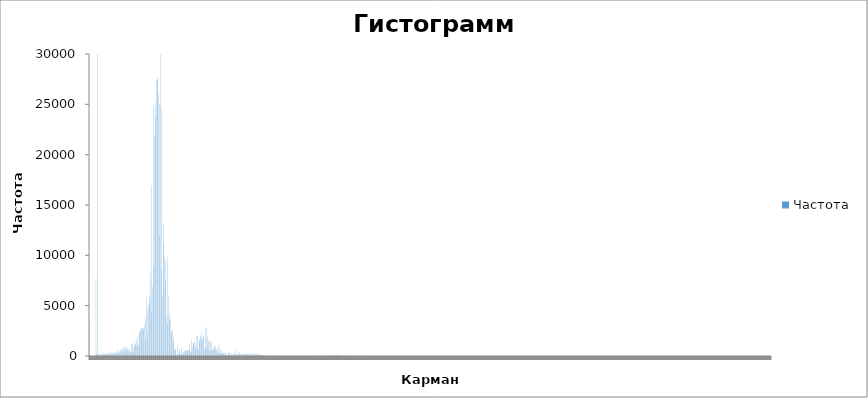
| Category | Частота |
|---|---|
| -1 | 3320 |
| -0,896408203 | 0 |
| -0,792816406 | 0 |
| -0,689224609 | 0 |
| -0,585632813 | 0 |
| -0,482041016 | 0 |
| -0,378449219 | 0 |
| -0,274857422 | 0 |
| -0,171265625 | 0 |
| -0,067673828 | 0 |
| 0,035917969 | 7700 |
| 0,139509766 | 240 |
| 0,243101563 | 80634 |
| 0,346693359 | 180 |
| 0,450285156 | 180 |
| 0,553876953 | 120 |
| 0,65746875 | 160 |
| 0,761060547 | 180 |
| 0,864652344 | 100 |
| 0,968244141 | 460 |
| 1,071835938 | 60 |
| 1,175427734 | 280 |
| 1,279019531 | 220 |
| 1,382611328 | 200 |
| 1,486203125 | 180 |
| 1,589794922 | 260 |
| 1,693386719 | 200 |
| 1,796978516 | 240 |
| 1,900570313 | 220 |
| 2,004162109 | 300 |
| 2,107753906 | 120 |
| 2,211345703 | 420 |
| 2,3149375 | 360 |
| 2,418529297 | 160 |
| 2,522121094 | 360 |
| 2,625712891 | 200 |
| 2,729304688 | 320 |
| 2,832896484 | 320 |
| 2,936488281 | 260 |
| 3,040080078 | 320 |
| 3,143671875 | 400 |
| 3,247263672 | 180 |
| 3,350855469 | 680 |
| 3,454447266 | 320 |
| 3,558039063 | 440 |
| 3,661630859 | 500 |
| 3,765222656 | 300 |
| 3,868814453 | 700 |
| 3,97240625 | 560 |
| 4,075998047 | 320 |
| 4,179589844 | 800 |
| 4,283181641 | 540 |
| 4,386773438 | 980 |
| 4,490365234 | 440 |
| 4,593957031 | 820 |
| 4,697548828 | 900 |
| 4,801140625 | 660 |
| 4,904732422 | 560 |
| 5,008324219 | 880 |
| 5,111916016 | 520 |
| 5,215507813 | 620 |
| 5,319099609 | 700 |
| 5,422691406 | 380 |
| 5,526283203 | 1160 |
| 5,629875 | 380 |
| 5,733466797 | 1280 |
| 5,837058594 | 420 |
| 5,940650391 | 940 |
| 6,044242188 | 1540 |
| 6,147833984 | 1160 |
| 6,251425781 | 1140 |
| 6,355017578 | 1600 |
| 6,458609375 | 980 |
| 6,562201172 | 2020 |
| 6,665792969 | 1120 |
| 6,769384766 | 2420 |
| 6,872976563 | 2200 |
| 6,976568359 | 2720 |
| 7,080160156 | 2620 |
| 7,183751953 | 2780 |
| 7,28734375 | 2760 |
| 7,390935547 | 2600 |
| 7,494527344 | 2800 |
| 7,598119141 | 3140 |
| 7,701710938 | 3800 |
| 7,805302734 | 1540 |
| 7,908894531 | 5860 |
| 8,012486328 | 2180 |
| 8,116078125 | 4580 |
| 8,219669922 | 5080 |
| 8,323261719 | 5380 |
| 8,426853516 | 6000 |
| 8,530445313 | 8240 |
| 8,634037109 | 4400 |
| 8,737628906 | 16940 |
| 8,841220703 | 6880 |
| 8,9448125 | 24860 |
| 9,048404297 | 8800 |
| 9,151996094 | 21700 |
| 9,255587891 | 23720 |
| 9,359179688 | 25180 |
| 9,462771484 | 27400 |
| 9,566363281 | 27620 |
| 9,669955078 | 27480 |
| 9,773546875 | 26160 |
| 9,877138672 | 25000 |
| 9,980730469 | 11960 |
| 10,08432227 | 30760 |
| 10,18791406 | 8580 |
| 10,29150586 | 24640 |
| 10,39509766 | 6100 |
| 10,49868945 | 13160 |
| 10,60228125 | 11260 |
| 10,70587305 | 9920 |
| 10,80946484 | 9520 |
| 10,91305664 | 7380 |
| 11,01664844 | 3920 |
| 11,12024023 | 9880 |
| 11,22383203 | 3120 |
| 11,32742383 | 5881 |
| 11,43101563 | 4260 |
| 11,53460742 | 3500 |
| 11,63819922 | 3620 |
| 11,74179102 | 2420 |
| 11,84538281 | 2420 |
| 11,94897461 | 2640 |
| 12,05256641 | 1860 |
| 12,1561582 | 1420 |
| 12,25975 | 720 |
| 12,3633418 | 500 |
| 12,46693359 | 740 |
| 12,57052539 | 120 |
| 12,67411719 | 1100 |
| 12,77770898 | 180 |
| 12,88130078 | 220 |
| 12,98489258 | 500 |
| 13,08848438 | 580 |
| 13,19207617 | 200 |
| 13,29566797 | 840 |
| 13,39925977 | 160 |
| 13,50285156 | 400 |
| 13,60644336 | 240 |
| 13,71003516 | 360 |
| 13,81362695 | 460 |
| 13,91721875 | 560 |
| 14,02081055 | 540 |
| 14,12440234 | 580 |
| 14,22799414 | 560 |
| 14,33158594 | 600 |
| 14,43517773 | 560 |
| 14,53876953 | 620 |
| 14,64236133 | 1180 |
| 14,74595313 | 320 |
| 14,84954492 | 1680 |
| 14,95313672 | 480 |
| 15,05672852 | 980 |
| 15,16032031 | 1320 |
| 15,26391211 | 1280 |
| 15,36750391 | 1340 |
| 15,4710957 | 1000 |
| 15,5746875 | 680 |
| 15,6782793 | 1960 |
| 15,78187109 | 720 |
| 15,88546289 | 2020 |
| 15,98905469 | 660 |
| 16,09264648 | 1700 |
| 16,19623828 | 1500 |
| 16,29983008 | 2040 |
| 16,40342188 | 2380 |
| 16,50701367 | 1660 |
| 16,61060547 | 1720 |
| 16,71419727 | 1940 |
| 16,81778906 | 2000 |
| 16,92138086 | 680 |
| 17,02497266 | 2720 |
| 17,12856445 | 860 |
| 17,23215625 | 2840 |
| 17,33574805 | 860 |
| 17,43933984 | 1900 |
| 17,54293164 | 1560 |
| 17,64652344 | 1520 |
| 17,75011523 | 520 |
| 17,85370703 | 1400 |
| 17,95729883 | 600 |
| 18,06089063 | 1500 |
| 18,16448242 | 560 |
| 18,26807422 | 700 |
| 18,37166602 | 840 |
| 18,47525781 | 1040 |
| 18,57884961 | 940 |
| 18,68244141 | 600 |
| 18,7860332 | 580 |
| 18,889625 | 860 |
| 18,9932168 | 640 |
| 19,09680859 | 360 |
| 19,20040039 | 1180 |
| 19,30399219 | 300 |
| 19,40758398 | 660 |
| 19,51117578 | 200 |
| 19,61476758 | 460 |
| 19,71835938 | 280 |
| 19,82195117 | 300 |
| 19,92554297 | 300 |
| 20,02913477 | 280 |
| 20,13272656 | 160 |
| 20,23631836 | 380 |
| 20,33991016 | 60 |
| 20,44350195 | 140 |
| 20,54709375 | 120 |
| 20,65068555 | 300 |
| 20,75427734 | 380 |
| 20,85786914 | 280 |
| 20,96146094 | 80 |
| 21,06505273 | 100 |
| 21,16864453 | 280 |
| 21,27223633 | 200 |
| 21,37582813 | 160 |
| 21,47941992 | 40 |
| 21,58301172 | 300 |
| 21,68660352 | 120 |
| 21,79019531 | 560 |
| 21,89378711 | 40 |
| 21,99737891 | 180 |
| 22,1009707 | 320 |
| 22,2045625 | 180 |
| 22,3081543 | 100 |
| 22,41174609 | 380 |
| 22,51533789 | 80 |
| 22,61892969 | 260 |
| 22,72252148 | 120 |
| 22,82611328 | 120 |
| 22,92970508 | 220 |
| 23,03329688 | 200 |
| 23,13688867 | 140 |
| 23,24048047 | 160 |
| 23,34407227 | 280 |
| 23,44766406 | 100 |
| 23,55125586 | 240 |
| 23,65484766 | 200 |
| 23,75843945 | 300 |
| 23,86203125 | 160 |
| 23,96562305 | 200 |
| 24,06921484 | 60 |
| 24,17280664 | 300 |
| 24,27639844 | 140 |
| 24,37999023 | 200 |
| 24,48358203 | 140 |
| 24,58717383 | 100 |
| 24,69076563 | 120 |
| 24,79435742 | 300 |
| 24,89794922 | 120 |
| 25,00154102 | 280 |
| 25,10513281 | 120 |
| 25,20872461 | 160 |
| 25,31231641 | 180 |
| 25,4159082 | 140 |
| 25,5195 | 100 |
| 25,6230918 | 120 |
| 25,72668359 | 40 |
| 25,83027539 | 100 |
| 25,93386719 | 40 |
| 26,03745898 | 60 |
| 26,14105078 | 80 |
| 26,24464258 | 0 |
| 26,34823438 | 80 |
| 26,45182617 | 80 |
| 26,55541797 | 20 |
| 26,65900977 | 60 |
| 26,76260156 | 40 |
| 26,86619336 | 0 |
| 26,96978516 | 0 |
| 27,07337695 | 60 |
| 27,17696875 | 0 |
| 27,28056055 | 0 |
| 27,38415234 | 20 |
| 27,48774414 | 40 |
| 27,59133594 | 0 |
| 27,69492773 | 0 |
| 27,79851953 | 60 |
| 27,90211133 | 60 |
| 28,00570313 | 60 |
| 28,10929492 | 40 |
| 28,21288672 | 20 |
| 28,31647852 | 20 |
| 28,42007031 | 0 |
| 28,52366211 | 20 |
| 28,62725391 | 0 |
| 28,7308457 | 20 |
| 28,8344375 | 0 |
| 28,9380293 | 0 |
| 29,04162109 | 0 |
| 29,14521289 | 0 |
| 29,24880469 | 20 |
| 29,35239648 | 40 |
| 29,45598828 | 0 |
| 29,55958008 | 40 |
| 29,66317188 | 0 |
| 29,76676367 | 0 |
| 29,87035547 | 20 |
| 29,97394727 | 60 |
| 30,07753906 | 40 |
| 30,18113086 | 20 |
| 30,28472266 | 40 |
| 30,38831445 | 60 |
| 30,49190625 | 0 |
| 30,59549805 | 0 |
| 30,69908984 | 0 |
| 30,80268164 | 0 |
| 30,90627344 | 20 |
| 31,00986523 | 0 |
| 31,11345703 | 0 |
| 31,21704883 | 20 |
| 31,32064063 | 60 |
| 31,42423242 | 0 |
| 31,52782422 | 20 |
| 31,63141602 | 0 |
| 31,73500781 | 0 |
| 31,83859961 | 0 |
| 31,94219141 | 40 |
| 32,0457832 | 0 |
| 32,149375 | 0 |
| 32,2529668 | 40 |
| 32,35655859 | 0 |
| 32,46015039 | 20 |
| 32,56374219 | 20 |
| 32,66733398 | 0 |
| 32,77092578 | 40 |
| 32,87451758 | 60 |
| 32,97810938 | 0 |
| 33,08170117 | 0 |
| 33,18529297 | 0 |
| 33,28888477 | 20 |
| 33,39247656 | 0 |
| 33,49606836 | 0 |
| 33,59966016 | 0 |
| 33,70325195 | 0 |
| 33,80684375 | 0 |
| 33,91043555 | 120 |
| 34,01402734 | 0 |
| 34,11761914 | 40 |
| 34,22121094 | 80 |
| 34,32480273 | 0 |
| 34,42839453 | 40 |
| 34,53198633 | 20 |
| 34,63557813 | 20 |
| 34,73916992 | 0 |
| 34,84276172 | 0 |
| 34,94635352 | 80 |
| 35,04994531 | 60 |
| 35,15353711 | 0 |
| 35,25712891 | 20 |
| 35,3607207 | 40 |
| 35,4643125 | 20 |
| 35,5679043 | 0 |
| 35,67149609 | 60 |
| 35,77508789 | 40 |
| 35,87867969 | 40 |
| 35,98227148 | 0 |
| 36,08586328 | 20 |
| 36,18945508 | 20 |
| 36,29304688 | 40 |
| 36,39663867 | 0 |
| 36,50023047 | 20 |
| 36,60382227 | 0 |
| 36,70741406 | 60 |
| 36,81100586 | 80 |
| 36,91459766 | 60 |
| 37,01818945 | 60 |
| 37,12178125 | 100 |
| 37,22537305 | 40 |
| 37,32896484 | 80 |
| 37,43255664 | 120 |
| 37,53614844 | 20 |
| 37,63974023 | 100 |
| 37,74333203 | 0 |
| 37,84692383 | 40 |
| 37,95051563 | 40 |
| 38,05410742 | 20 |
| 38,15769922 | 40 |
| 38,26129102 | 40 |
| 38,36488281 | 0 |
| 38,46847461 | 40 |
| 38,57206641 | 40 |
| 38,6756582 | 60 |
| 38,77925 | 0 |
| 38,8828418 | 40 |
| 38,98643359 | 20 |
| 39,09002539 | 0 |
| 39,19361719 | 40 |
| 39,29720898 | 0 |
| 39,40080078 | 20 |
| 39,50439258 | 40 |
| 39,60798438 | 40 |
| 39,71157617 | 20 |
| 39,81516797 | 20 |
| 39,91875977 | 20 |
| 40,02235156 | 0 |
| 40,12594336 | 0 |
| 40,22953516 | 20 |
| 40,33312695 | 40 |
| 40,43671875 | 60 |
| 40,54031055 | 40 |
| 40,64390234 | 20 |
| 40,74749414 | 20 |
| 40,85108594 | 20 |
| 40,95467773 | 40 |
| 41,05826953 | 0 |
| 41,16186133 | 80 |
| 41,26545313 | 80 |
| 41,36904492 | 0 |
| 41,47263672 | 20 |
| 41,57622852 | 0 |
| 41,67982031 | 0 |
| 41,78341211 | 0 |
| 41,88700391 | 20 |
| 41,9905957 | 20 |
| 42,0941875 | 20 |
| 42,1977793 | 40 |
| 42,30137109 | 0 |
| 42,40496289 | 40 |
| 42,50855469 | 0 |
| 42,61214648 | 0 |
| 42,71573828 | 0 |
| 42,81933008 | 20 |
| 42,92292188 | 0 |
| 43,02651367 | 0 |
| 43,13010547 | 40 |
| 43,23369727 | 0 |
| 43,33728906 | 0 |
| 43,44088086 | 0 |
| 43,54447266 | 0 |
| 43,64806445 | 20 |
| 43,75165625 | 40 |
| 43,85524805 | 40 |
| 43,95883984 | 0 |
| 44,06243164 | 0 |
| 44,16602344 | 0 |
| 44,26961523 | 0 |
| 44,37320703 | 20 |
| 44,47679883 | 0 |
| 44,58039063 | 0 |
| 44,68398242 | 0 |
| 44,78757422 | 20 |
| 44,89116602 | 0 |
| 44,99475781 | 0 |
| 45,09834961 | 20 |
| 45,20194141 | 0 |
| 45,3055332 | 20 |
| 45,409125 | 20 |
| 45,5127168 | 0 |
| 45,61630859 | 0 |
| 45,71990039 | 0 |
| 45,82349219 | 0 |
| 45,92708398 | 0 |
| 46,03067578 | 0 |
| 46,13426758 | 0 |
| 46,23785938 | 0 |
| 46,34145117 | 0 |
| 46,44504297 | 0 |
| 46,54863477 | 0 |
| 46,65222656 | 0 |
| 46,75581836 | 0 |
| 46,85941016 | 0 |
| 46,96300195 | 0 |
| 47,06659375 | 0 |
| 47,17018555 | 0 |
| 47,27377734 | 0 |
| 47,37736914 | 40 |
| 47,48096094 | 0 |
| 47,58455273 | 0 |
| 47,68814453 | 0 |
| 47,79173633 | 0 |
| 47,89532813 | 0 |
| 47,99891992 | 0 |
| 48,10251172 | 0 |
| 48,20610352 | 0 |
| 48,30969531 | 0 |
| 48,41328711 | 20 |
| 48,51687891 | 0 |
| 48,6204707 | 0 |
| 48,7240625 | 20 |
| 48,8276543 | 0 |
| 48,93124609 | 40 |
| 49,03483789 | 40 |
| 49,13842969 | 0 |
| 49,24202148 | 0 |
| 49,34561328 | 0 |
| 49,44920508 | 20 |
| 49,55279688 | 0 |
| 49,65638867 | 0 |
| 49,75998047 | 0 |
| 49,86357227 | 0 |
| 49,96716406 | 0 |
| 50,07075586 | 0 |
| 50,17434766 | 0 |
| 50,27793945 | 20 |
| 50,38153125 | 0 |
| 50,48512305 | 0 |
| 50,58871484 | 0 |
| 50,69230664 | 0 |
| 50,79589844 | 0 |
| 50,89949023 | 0 |
| 51,00308203 | 0 |
| 51,10667383 | 0 |
| 51,21026563 | 0 |
| 51,31385742 | 0 |
| 51,41744922 | 0 |
| 51,52104102 | 0 |
| 51,62463281 | 0 |
| 51,72822461 | 0 |
| 51,83181641 | 0 |
| 51,9354082 | 0 |
| 52,039 | 0 |
| 52,1425918 | 20 |
| 52,24618359 | 0 |
| 52,34977539 | 0 |
| 52,45336719 | 0 |
| 52,55695898 | 0 |
| 52,66055078 | 20 |
| 52,76414258 | 0 |
| 52,86773438 | 0 |
| 52,97132617 | 0 |
| 53,07491797 | 0 |
| 53,17850977 | 0 |
| 53,28210156 | 0 |
| 53,38569336 | 0 |
| 53,48928516 | 0 |
| 53,59287695 | 0 |
| 53,69646875 | 0 |
| 53,80006055 | 0 |
| 53,90365234 | 40 |
| 54,00724414 | 0 |
| 54,11083594 | 0 |
| 54,21442773 | 0 |
| 54,31801953 | 0 |
| 54,42161133 | 0 |
| 54,52520313 | 0 |
| 54,62879492 | 0 |
| 54,73238672 | 0 |
| 54,83597852 | 0 |
| 54,93957031 | 0 |
| 55,04316211 | 0 |
| 55,14675391 | 0 |
| 55,2503457 | 0 |
| 55,3539375 | 0 |
| 55,4575293 | 0 |
| 55,56112109 | 0 |
| 55,66471289 | 0 |
| 55,76830469 | 0 |
| 55,87189648 | 0 |
| 55,97548828 | 0 |
| 56,07908008 | 0 |
| 56,18267188 | 0 |
| 56,28626367 | 0 |
| 56,38985547 | 0 |
| 56,49344727 | 0 |
| 56,59703906 | 0 |
| 56,70063086 | 0 |
| 56,80422266 | 0 |
| 56,90781445 | 0 |
| 57,01140625 | 0 |
| 57,11499805 | 0 |
| 57,21858984 | 0 |
| 57,32218164 | 0 |
| 57,42577344 | 20 |
| 57,52936523 | 20 |
| 57,63295703 | 0 |
| 57,73654883 | 0 |
| 57,84014063 | 0 |
| 57,94373242 | 0 |
| 58,04732422 | 0 |
| 58,15091602 | 0 |
| 58,25450781 | 0 |
| 58,35809961 | 0 |
| 58,46169141 | 0 |
| 58,5652832 | 0 |
| 58,668875 | 0 |
| 58,7724668 | 0 |
| 58,87605859 | 0 |
| 58,97965039 | 0 |
| 59,08324219 | 0 |
| 59,18683398 | 0 |
| 59,29042578 | 0 |
| 59,39401758 | 0 |
| 59,49760938 | 0 |
| 59,60120117 | 0 |
| 59,70479297 | 0 |
| 59,80838477 | 0 |
| 59,91197656 | 0 |
| 60,01556836 | 0 |
| 60,11916016 | 0 |
| 60,22275195 | 0 |
| 60,32634375 | 0 |
| 60,42993555 | 0 |
| 60,53352734 | 0 |
| 60,63711914 | 0 |
| 60,74071094 | 0 |
| 60,84430273 | 0 |
| 60,94789453 | 0 |
| 61,05148633 | 0 |
| 61,15507813 | 0 |
| 61,25866992 | 0 |
| 61,36226172 | 0 |
| 61,46585352 | 0 |
| 61,56944531 | 0 |
| 61,67303711 | 0 |
| 61,77662891 | 0 |
| 61,8802207 | 0 |
| 61,9838125 | 0 |
| 62,0874043 | 0 |
| 62,19099609 | 0 |
| 62,29458789 | 20 |
| 62,39817969 | 0 |
| 62,50177148 | 0 |
| 62,60536328 | 0 |
| 62,70895508 | 0 |
| 62,81254688 | 0 |
| 62,91613867 | 0 |
| 63,01973047 | 0 |
| 63,12332227 | 0 |
| 63,22691406 | 0 |
| 63,33050586 | 0 |
| 63,43409766 | 0 |
| 63,53768945 | 0 |
| 63,64128125 | 0 |
| 63,74487305 | 0 |
| 63,84846484 | 0 |
| 63,95205664 | 0 |
| 64,05564844 | 0 |
| 64,15924023 | 0 |
| 64,26283203 | 0 |
| 64,36642383 | 0 |
| 64,47001563 | 0 |
| 64,57360742 | 20 |
| 64,67719922 | 0 |
| 64,78079102 | 0 |
| 64,88438281 | 0 |
| 64,98797461 | 0 |
| 65,09156641 | 0 |
| 65,1951582 | 0 |
| 65,29875 | 0 |
| 65,4023418 | 0 |
| 65,50593359 | 0 |
| 65,60952539 | 0 |
| 65,71311719 | 0 |
| 65,81670898 | 20 |
| 65,92030078 | 0 |
| 66,02389258 | 0 |
| 66,12748438 | 0 |
| 66,23107617 | 0 |
| 66,33466797 | 0 |
| 66,43825977 | 0 |
| 66,54185156 | 0 |
| 66,64544336 | 0 |
| 66,74903516 | 0 |
| 66,85262695 | 0 |
| 66,95621875 | 0 |
| 67,05981055 | 20 |
| 67,16340234 | 0 |
| 67,26699414 | 0 |
| 67,37058594 | 0 |
| 67,47417773 | 0 |
| 67,57776953 | 0 |
| 67,68136133 | 0 |
| 67,78495313 | 0 |
| 67,88854492 | 0 |
| 67,99213672 | 0 |
| 68,09572852 | 0 |
| 68,19932031 | 0 |
| 68,30291211 | 0 |
| 68,40650391 | 0 |
| 68,5100957 | 0 |
| 68,6136875 | 0 |
| 68,7172793 | 0 |
| 68,82087109 | 0 |
| 68,92446289 | 0 |
| 69,02805469 | 0 |
| 69,13164648 | 0 |
| 69,23523828 | 0 |
| 69,33883008 | 0 |
| 69,44242188 | 0 |
| 69,54601367 | 0 |
| 69,64960547 | 0 |
| 69,75319727 | 0 |
| 69,85678906 | 0 |
| 69,96038086 | 0 |
| 70,06397266 | 0 |
| 70,16756445 | 0 |
| 70,27115625 | 0 |
| 70,37474805 | 0 |
| 70,47833984 | 0 |
| 70,58193164 | 0 |
| 70,68552344 | 0 |
| 70,78911523 | 0 |
| 70,89270703 | 0 |
| 70,99629883 | 0 |
| 71,09989063 | 0 |
| 71,20348242 | 0 |
| 71,30707422 | 0 |
| 71,41066602 | 0 |
| 71,51425781 | 0 |
| 71,61784961 | 0 |
| 71,72144141 | 0 |
| 71,8250332 | 0 |
| 71,928625 | 0 |
| 72,0322168 | 0 |
| 72,13580859 | 0 |
| 72,23940039 | 0 |
| 72,34299219 | 0 |
| 72,44658398 | 0 |
| 72,55017578 | 0 |
| 72,65376758 | 0 |
| 72,75735938 | 0 |
| 72,86095117 | 0 |
| 72,96454297 | 0 |
| 73,06813477 | 0 |
| 73,17172656 | 0 |
| 73,27531836 | 20 |
| 73,37891016 | 0 |
| 73,48250195 | 0 |
| 73,58609375 | 0 |
| 73,68968555 | 0 |
| 73,79327734 | 0 |
| 73,89686914 | 0 |
| 74,00046094 | 0 |
| 74,10405273 | 0 |
| 74,20764453 | 0 |
| 74,31123633 | 0 |
| 74,41482813 | 0 |
| 74,51841992 | 0 |
| 74,62201172 | 0 |
| 74,72560352 | 0 |
| 74,82919531 | 0 |
| 74,93278711 | 20 |
| 75,03637891 | 0 |
| 75,1399707 | 0 |
| 75,2435625 | 20 |
| 75,3471543 | 0 |
| 75,45074609 | 0 |
| 75,55433789 | 0 |
| 75,65792969 | 0 |
| 75,76152148 | 0 |
| 75,86511328 | 40 |
| 75,96870508 | 0 |
| 76,07229688 | 0 |
| 76,17588867 | 0 |
| 76,27948047 | 0 |
| 76,38307227 | 0 |
| 76,48666406 | 0 |
| 76,59025586 | 0 |
| 76,69384766 | 0 |
| 76,79743945 | 0 |
| 76,90103125 | 0 |
| 77,00462305 | 0 |
| 77,10821484 | 0 |
| 77,21180664 | 0 |
| 77,31539844 | 20 |
| 77,41899023 | 0 |
| 77,52258203 | 0 |
| 77,62617383 | 0 |
| 77,72976563 | 0 |
| 77,83335742 | 0 |
| 77,93694922 | 0 |
| 78,04054102 | 0 |
| 78,14413281 | 0 |
| 78,24772461 | 0 |
| 78,35131641 | 0 |
| 78,4549082 | 0 |
| 78,5585 | 0 |
| 78,6620918 | 0 |
| 78,76568359 | 0 |
| 78,86927539 | 0 |
| 78,97286719 | 0 |
| 79,07645898 | 0 |
| 79,18005078 | 0 |
| 79,28364258 | 0 |
| 79,38723438 | 0 |
| 79,49082617 | 0 |
| 79,59441797 | 20 |
| 79,69800977 | 0 |
| 79,80160156 | 0 |
| 79,90519336 | 0 |
| 80,00878516 | 0 |
| 80,11237695 | 0 |
| 80,21596875 | 0 |
| 80,31956055 | 0 |
| 80,42315234 | 0 |
| 80,52674414 | 0 |
| 80,63033594 | 0 |
| 80,73392773 | 0 |
| 80,83751953 | 0 |
| 80,94111133 | 0 |
| 81,04470313 | 0 |
| 81,14829492 | 0 |
| 81,25188672 | 0 |
| 81,35547852 | 0 |
| 81,45907031 | 0 |
| 81,56266211 | 0 |
| 81,66625391 | 0 |
| 81,7698457 | 0 |
| 81,8734375 | 0 |
| 81,9770293 | 0 |
| 82,08062109 | 0 |
| 82,18421289 | 0 |
| 82,28780469 | 0 |
| 82,39139648 | 0 |
| 82,49498828 | 0 |
| 82,59858008 | 0 |
| 82,70217188 | 0 |
| 82,80576367 | 0 |
| 82,90935547 | 0 |
| 83,01294727 | 0 |
| 83,11653906 | 0 |
| 83,22013086 | 0 |
| 83,32372266 | 0 |
| 83,42731445 | 0 |
| 83,53090625 | 0 |
| 83,63449805 | 0 |
| 83,73808984 | 0 |
| 83,84168164 | 0 |
| 83,94527344 | 0 |
| 84,04886523 | 0 |
| 84,15245703 | 0 |
| 84,25604883 | 0 |
| 84,35964063 | 0 |
| 84,46323242 | 0 |
| 84,56682422 | 0 |
| 84,67041602 | 0 |
| 84,77400781 | 0 |
| 84,87759961 | 0 |
| 84,98119141 | 0 |
| 85,0847832 | 0 |
| 85,188375 | 0 |
| 85,2919668 | 0 |
| 85,39555859 | 0 |
| 85,49915039 | 0 |
| 85,60274219 | 0 |
| 85,70633398 | 0 |
| 85,80992578 | 0 |
| 85,91351758 | 0 |
| 86,01710938 | 0 |
| 86,12070117 | 0 |
| 86,22429297 | 0 |
| 86,32788477 | 0 |
| 86,43147656 | 0 |
| 86,53506836 | 0 |
| 86,63866016 | 0 |
| 86,74225195 | 0 |
| 86,84584375 | 0 |
| 86,94943555 | 0 |
| 87,05302734 | 0 |
| 87,15661914 | 0 |
| 87,26021094 | 20 |
| 87,36380273 | 20 |
| 87,46739453 | 0 |
| 87,57098633 | 0 |
| 87,67457813 | 0 |
| 87,77816992 | 0 |
| 87,88176172 | 0 |
| 87,98535352 | 0 |
| 88,08894531 | 0 |
| 88,19253711 | 0 |
| 88,29612891 | 0 |
| 88,3997207 | 0 |
| 88,5033125 | 0 |
| 88,6069043 | 0 |
| 88,71049609 | 0 |
| 88,81408789 | 0 |
| 88,91767969 | 0 |
| 89,02127148 | 0 |
| 89,12486328 | 0 |
| 89,22845508 | 0 |
| 89,33204688 | 0 |
| 89,43563867 | 0 |
| 89,53923047 | 0 |
| 89,64282227 | 0 |
| 89,74641406 | 0 |
| 89,85000586 | 0 |
| 89,95359766 | 0 |
| 90,05718945 | 0 |
| 90,16078125 | 0 |
| 90,26437305 | 0 |
| 90,36796484 | 0 |
| 90,47155664 | 0 |
| 90,57514844 | 0 |
| 90,67874023 | 0 |
| 90,78233203 | 0 |
| 90,88592383 | 0 |
| 90,98951563 | 0 |
| 91,09310742 | 0 |
| 91,19669922 | 0 |
| 91,30029102 | 0 |
| 91,40388281 | 0 |
| 91,50747461 | 0 |
| 91,61106641 | 0 |
| 91,7146582 | 0 |
| 91,81825 | 0 |
| 91,9218418 | 0 |
| 92,02543359 | 0 |
| 92,12902539 | 0 |
| 92,23261719 | 0 |
| 92,33620898 | 0 |
| 92,43980078 | 0 |
| 92,54339258 | 0 |
| 92,64698438 | 0 |
| 92,75057617 | 0 |
| 92,85416797 | 0 |
| 92,95775977 | 0 |
| 93,06135156 | 0 |
| 93,16494336 | 0 |
| 93,26853516 | 0 |
| 93,37212695 | 0 |
| 93,47571875 | 0 |
| 93,57931055 | 0 |
| 93,68290234 | 0 |
| 93,78649414 | 0 |
| 93,89008594 | 0 |
| 93,99367773 | 0 |
| 94,09726953 | 0 |
| 94,20086133 | 0 |
| 94,30445313 | 0 |
| 94,40804492 | 0 |
| 94,51163672 | 0 |
| 94,61522852 | 0 |
| 94,71882031 | 0 |
| 94,82241211 | 0 |
| 94,92600391 | 0 |
| 95,0295957 | 0 |
| 95,1331875 | 0 |
| 95,2367793 | 0 |
| 95,34037109 | 0 |
| 95,44396289 | 0 |
| 95,54755469 | 0 |
| 95,65114648 | 0 |
| 95,75473828 | 0 |
| 95,85833008 | 0 |
| 95,96192188 | 0 |
| 96,06551367 | 0 |
| 96,16910547 | 0 |
| 96,27269727 | 0 |
| 96,37628906 | 0 |
| 96,47988086 | 0 |
| 96,58347266 | 0 |
| 96,68706445 | 0 |
| 96,79065625 | 0 |
| 96,89424805 | 0 |
| 96,99783984 | 0 |
| 97,10143164 | 0 |
| 97,20502344 | 0 |
| 97,30861523 | 0 |
| 97,41220703 | 0 |
| 97,51579883 | 0 |
| 97,61939063 | 0 |
| 97,72298242 | 0 |
| 97,82657422 | 0 |
| 97,93016602 | 0 |
| 98,03375781 | 0 |
| 98,13734961 | 0 |
| 98,24094141 | 0 |
| 98,3445332 | 0 |
| 98,448125 | 0 |
| 98,5517168 | 0 |
| 98,65530859 | 0 |
| 98,75890039 | 0 |
| 98,86249219 | 0 |
| 98,96608398 | 0 |
| 99,06967578 | 0 |
| 99,17326758 | 0 |
| 99,27685938 | 0 |
| 99,38045117 | 0 |
| 99,48404297 | 0 |
| 99,58763477 | 0 |
| 99,69122656 | 0 |
| 99,79481836 | 0 |
| 99,89841016 | 0 |
| 100,002002 | 0 |
| 100,1055938 | 0 |
| 100,2091855 | 0 |
| 100,3127773 | 0 |
| 100,4163691 | 0 |
| 100,5199609 | 0 |
| 100,6235527 | 0 |
| 100,7271445 | 0 |
| 100,8307363 | 0 |
| 100,9343281 | 0 |
| 101,0379199 | 0 |
| 101,1415117 | 0 |
| 101,2451035 | 0 |
| 101,3486953 | 0 |
| 101,4522871 | 0 |
| 101,5558789 | 0 |
| 101,6594707 | 0 |
| 101,7630625 | 0 |
| 101,8666543 | 0 |
| 101,9702461 | 0 |
| 102,0738379 | 0 |
| 102,1774297 | 0 |
| 102,2810215 | 0 |
| 102,3846133 | 0 |
| 102,4882051 | 0 |
| 102,5917969 | 0 |
| 102,6953887 | 0 |
| 102,7989805 | 0 |
| 102,9025723 | 0 |
| 103,0061641 | 0 |
| 103,1097559 | 0 |
| 103,2133477 | 0 |
| 103,3169395 | 0 |
| 103,4205313 | 0 |
| 103,524123 | 0 |
| 103,6277148 | 0 |
| 103,7313066 | 0 |
| 103,8348984 | 0 |
| 103,9384902 | 0 |
| 104,042082 | 0 |
| 104,1456738 | 0 |
| 104,2492656 | 0 |
| 104,3528574 | 0 |
| 104,4564492 | 0 |
| 104,560041 | 0 |
| 104,6636328 | 0 |
| 104,7672246 | 0 |
| 104,8708164 | 0 |
| 104,9744082 | 0 |
| Еще | 40 |